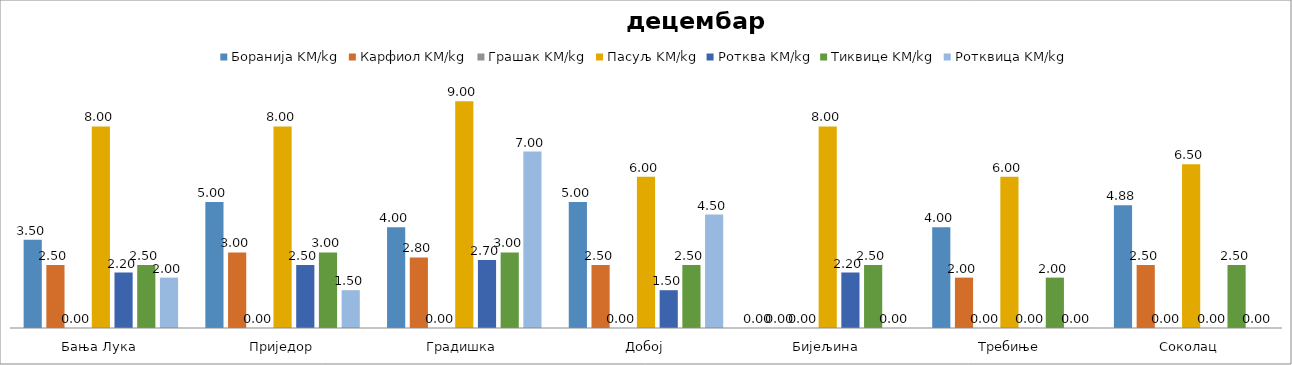
| Category | Боранија KM/kg | Карфиол KM/kg | Грашак KM/kg | Пасуљ KM/kg | Ротква KM/kg | Тиквице KM/kg | Ротквица KM/kg |
|---|---|---|---|---|---|---|---|
| Бања Лука | 3.5 | 2.5 | 0 | 8 | 2.2 | 2.5 | 2 |
| Приједор | 5 | 3 | 0 | 8 | 2.5 | 3 | 1.5 |
| Градишка | 4 | 2.8 | 0 | 9 | 2.7 | 3 | 7 |
| Добој | 5 | 2.5 | 0 | 6 | 1.5 | 2.5 | 4.5 |
| Бијељина | 0 | 0 | 0 | 8 | 2.2 | 2.5 | 0 |
|  Требиње | 4 | 2 | 0 | 6 | 0 | 2 | 0 |
| Соколац | 4.875 | 2.5 | 0 | 6.5 | 0 | 2.5 | 0 |